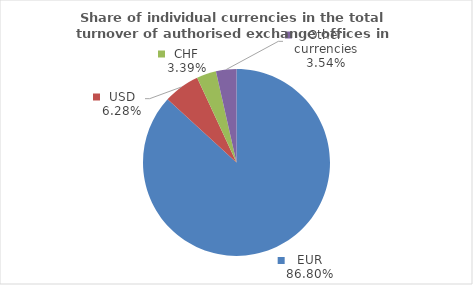
| Category | Series 0 |
|---|---|
| EUR | 86.802 |
| USD | 6.282 |
| CHF | 3.382 |
| Other currencies | 3.533 |